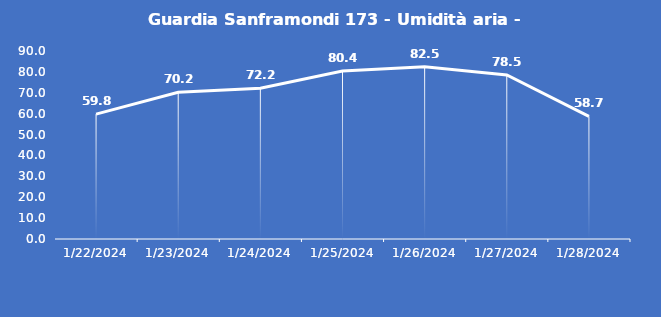
| Category | Guardia Sanframondi 173 - Umidità aria - Grezzo (%) |
|---|---|
| 1/22/24 | 59.8 |
| 1/23/24 | 70.2 |
| 1/24/24 | 72.2 |
| 1/25/24 | 80.4 |
| 1/26/24 | 82.5 |
| 1/27/24 | 78.5 |
| 1/28/24 | 58.7 |